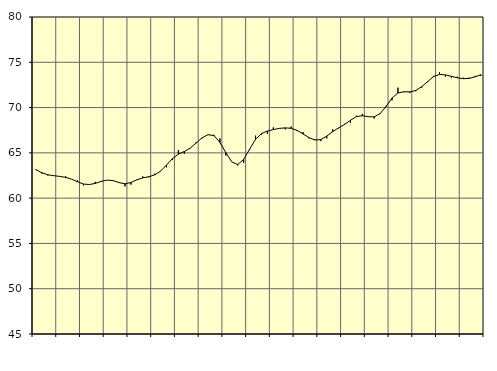
| Category | Piggar | Samtliga anställda (inkl. anställda utomlands) |
|---|---|---|
| nan | 63.2 | 63.14 |
| 1.0 | 62.7 | 62.8 |
| 1.0 | 62.5 | 62.58 |
| 1.0 | 62.5 | 62.48 |
| nan | 62.4 | 62.4 |
| 2.0 | 62.4 | 62.29 |
| 2.0 | 62.1 | 62.1 |
| 2.0 | 62 | 61.81 |
| nan | 61.4 | 61.56 |
| 3.0 | 61.5 | 61.5 |
| 3.0 | 61.8 | 61.63 |
| 3.0 | 61.9 | 61.85 |
| nan | 62 | 61.99 |
| 4.0 | 61.9 | 61.93 |
| 4.0 | 61.7 | 61.72 |
| 4.0 | 61.3 | 61.58 |
| nan | 61.5 | 61.73 |
| 5.0 | 62 | 62.02 |
| 5.0 | 62.4 | 62.24 |
| 5.0 | 62.3 | 62.36 |
| nan | 62.7 | 62.57 |
| 6.0 | 63 | 62.98 |
| 6.0 | 63.4 | 63.66 |
| 6.0 | 64.2 | 64.37 |
| nan | 65.3 | 64.86 |
| 7.0 | 64.9 | 65.15 |
| 7.0 | 65.5 | 65.53 |
| 7.0 | 66.2 | 66.09 |
| nan | 66.6 | 66.66 |
| 8.0 | 67 | 67.01 |
| 8.0 | 67 | 66.9 |
| 8.0 | 66.6 | 66.15 |
| nan | 64.7 | 65.02 |
| 9.0 | 64 | 64 |
| 9.0 | 63.6 | 63.71 |
| 9.0 | 63.9 | 64.28 |
| nan | 65.3 | 65.41 |
| 10.0 | 66.9 | 66.49 |
| 10.0 | 67 | 67.12 |
| 10.0 | 67.1 | 67.41 |
| nan | 67.8 | 67.57 |
| 11.0 | 67.7 | 67.7 |
| 11.0 | 67.6 | 67.76 |
| 11.0 | 67.9 | 67.71 |
| nan | 67.4 | 67.48 |
| 12.0 | 67.3 | 67.09 |
| 12.0 | 66.6 | 66.69 |
| 12.0 | 66.5 | 66.42 |
| nan | 66.3 | 66.46 |
| 13.0 | 66.6 | 66.85 |
| 13.0 | 67.6 | 67.34 |
| 13.0 | 67.7 | 67.76 |
| nan | 68.2 | 68.13 |
| 14.0 | 68.3 | 68.6 |
| 14.0 | 69.1 | 69 |
| 14.0 | 69.3 | 69.1 |
| nan | 69 | 68.99 |
| 15.0 | 68.8 | 68.98 |
| 15.0 | 69.4 | 69.34 |
| 15.0 | 70.2 | 70.12 |
| nan | 70.8 | 71.05 |
| 16.0 | 72.2 | 71.61 |
| 16.0 | 71.7 | 71.75 |
| 16.0 | 71.6 | 71.73 |
| nan | 71.8 | 71.89 |
| 17.0 | 72.2 | 72.3 |
| 17.0 | 72.8 | 72.87 |
| 17.0 | 73.5 | 73.42 |
| nan | 73.9 | 73.66 |
| 18.0 | 73.4 | 73.61 |
| 18.0 | 73.3 | 73.45 |
| 18.0 | 73.4 | 73.29 |
| nan | 73.3 | 73.19 |
| 19.0 | 73.3 | 73.22 |
| 19.0 | 73.5 | 73.4 |
| 19.0 | 73.5 | 73.62 |